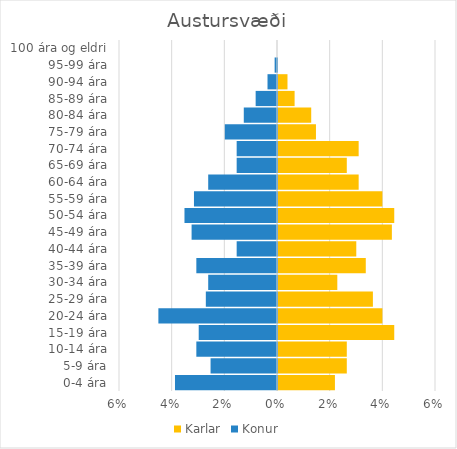
| Category | Karlar | Konur |
|---|---|---|
| 0-4 ára | 0.022 | -0.039 |
| 5-9 ára | 0.026 | -0.025 |
| 10-14 ára | 0.026 | -0.031 |
| 15-19 ára | 0.044 | -0.03 |
| 20-24 ára | 0.04 | -0.045 |
| 25-29 ára | 0.036 | -0.027 |
| 30-34 ára | 0.023 | -0.026 |
| 35-39 ára | 0.033 | -0.031 |
| 40-44 ára | 0.03 | -0.015 |
| 45-49 ára | 0.043 | -0.032 |
| 50-54 ára | 0.044 | -0.035 |
| 55-59 ára | 0.04 | -0.032 |
| 60-64 ára | 0.031 | -0.026 |
| 65-69 ára | 0.026 | -0.015 |
| 70-74 ára | 0.031 | -0.015 |
| 75-79 ára | 0.014 | -0.02 |
| 80-84 ára | 0.013 | -0.013 |
| 85-89 ára | 0.006 | -0.008 |
| 90-94 ára | 0.004 | -0.004 |
| 95-99 ára | 0 | -0.001 |
| 100 ára og eldri | 0 | 0 |